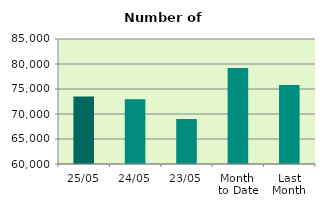
| Category | Series 0 |
|---|---|
| 25/05 | 73494 |
| 24/05 | 72956 |
| 23/05 | 69004 |
| Month 
to Date | 79179.294 |
| Last
Month | 75814.526 |